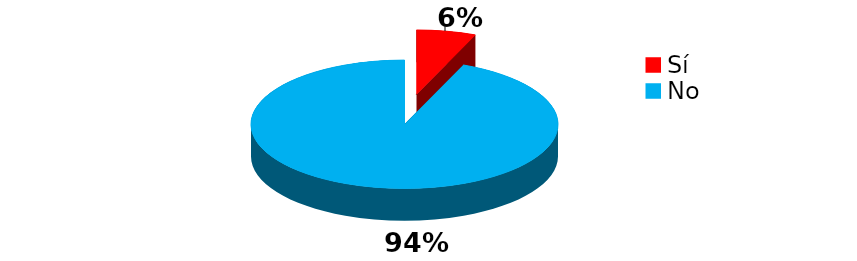
| Category | Series 0 |
|---|---|
| Sí | 13 |
| No | 195 |